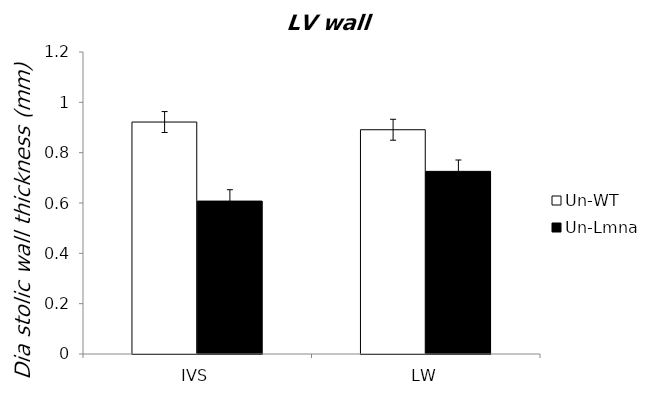
| Category | Un-WT | Un-Lmna |
|---|---|---|
| 0 | 0.922 | 0.608 |
| 1 | 0.891 | 0.726 |